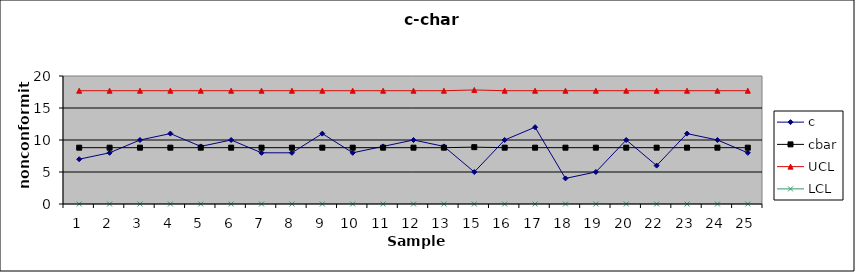
| Category | c | cbar | UCL | LCL |
|---|---|---|---|---|
| 1.0 | 7 | 8.8 | 17.699 | 0 |
| 2.0 | 8 | 8.8 | 17.699 | 0 |
| 3.0 | 10 | 8.8 | 17.699 | 0 |
| 4.0 | 11 | 8.8 | 17.699 | 0 |
| 5.0 | 9 | 8.8 | 17.699 | 0 |
| 6.0 | 10 | 8.8 | 17.699 | 0 |
| 7.0 | 8 | 8.8 | 17.699 | 0 |
| 8.0 | 8 | 8.8 | 17.699 | 0 |
| 9.0 | 11 | 8.8 | 17.699 | 0 |
| 10.0 | 8 | 8.8 | 17.699 | 0 |
| 11.0 | 9 | 8.8 | 17.699 | 0 |
| 12.0 | 10 | 8.8 | 17.699 | 0 |
| 13.0 | 9 | 8.8 | 17.699 | 0 |
| 15.0 | 5 | 8.88 | 17.82 | 0 |
| 16.0 | 10 | 8.8 | 17.699 | 0 |
| 17.0 | 12 | 8.8 | 17.699 | 0 |
| 18.0 | 4 | 8.8 | 17.699 | 0 |
| 19.0 | 5 | 8.8 | 17.699 | 0 |
| 20.0 | 10 | 8.8 | 17.699 | 0 |
| 22.0 | 6 | 8.8 | 17.699 | 0 |
| 23.0 | 11 | 8.8 | 17.699 | 0 |
| 24.0 | 10 | 8.8 | 17.699 | 0 |
| 25.0 | 8 | 8.8 | 17.699 | 0 |